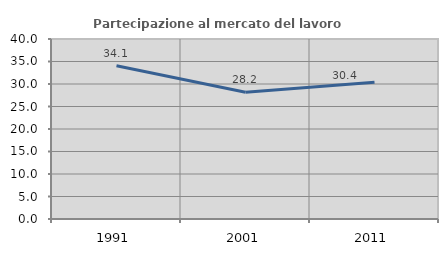
| Category | Partecipazione al mercato del lavoro  femminile |
|---|---|
| 1991.0 | 34.069 |
| 2001.0 | 28.162 |
| 2011.0 | 30.38 |